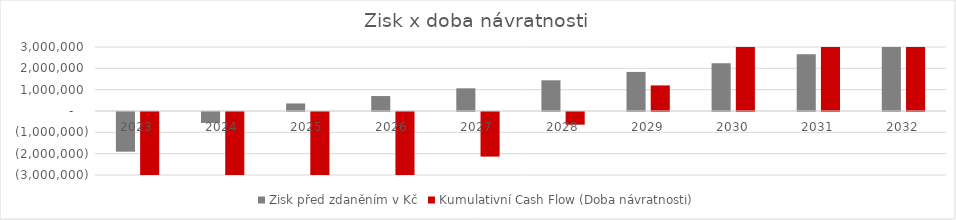
| Category | Zisk před zdaněním v Kč | Kumulativní Cash Flow (Doba návratnosti) |
|---|---|---|
| 0 | -1860145.341 | -4631248.844 |
| 1 | -510620.069 | -4769504.073 |
| 2 | 353661.428 | -4332405.971 |
| 3 | 701367.561 | -3392098.274 |
| 4 | 1063225.228 | -2091114.967 |
| 5 | 1439702.634 | -592953.611 |
| 6 | 1831282.564 | 1198913.586 |
| 7 | 2238462.828 | 3335582.57 |
| 8 | 2661756.715 | 5830707.632 |
| 9 | 3101693.467 | 8698391.609 |